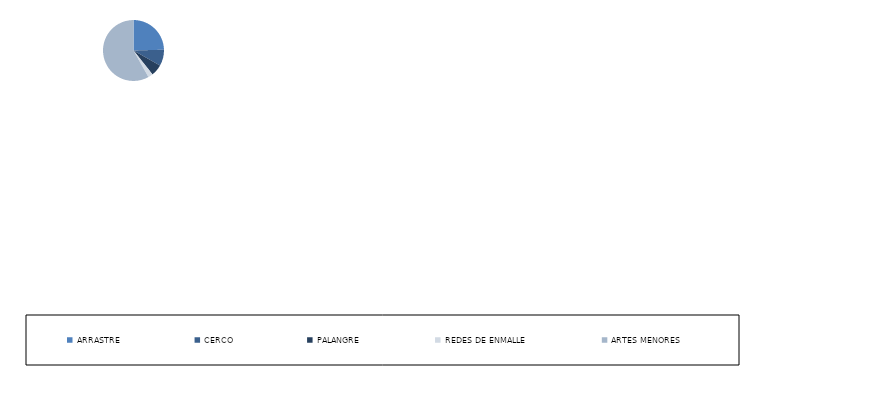
| Category | Series 0 |
|---|---|
| ARRASTRE | 356 |
| CERCO | 125 |
| PALANGRE | 88 |
| REDES DE ENMALLE | 37 |
| ARTES MENORES | 842 |